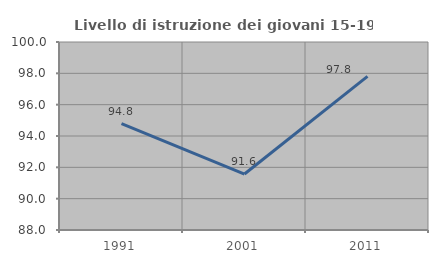
| Category | Livello di istruzione dei giovani 15-19 anni |
|---|---|
| 1991.0 | 94.785 |
| 2001.0 | 91.573 |
| 2011.0 | 97.802 |